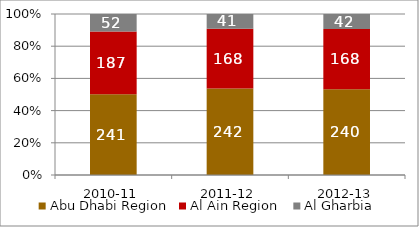
| Category | Abu Dhabi Region | Al Ain Region  | Al Gharbia |
|---|---|---|---|
| 2010-11 | 241 | 187 | 52 |
| 2011-12 | 242 | 168 | 41 |
| 2012-13 | 240 | 168 | 42 |